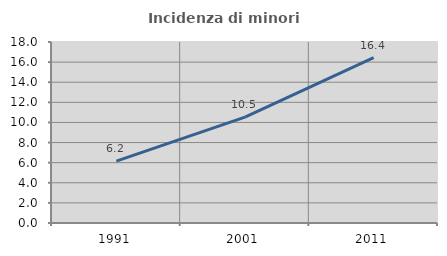
| Category | Incidenza di minori stranieri |
|---|---|
| 1991.0 | 6.154 |
| 2001.0 | 10.526 |
| 2011.0 | 16.443 |